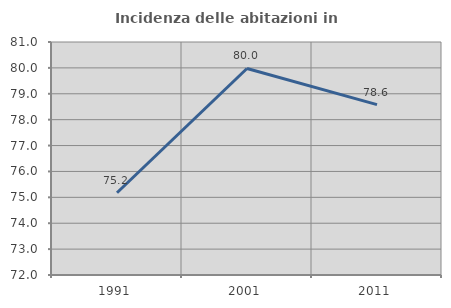
| Category | Incidenza delle abitazioni in proprietà  |
|---|---|
| 1991.0 | 75.178 |
| 2001.0 | 79.977 |
| 2011.0 | 78.579 |